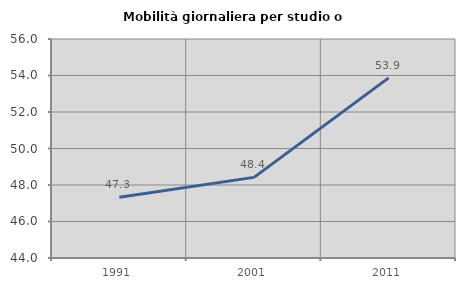
| Category | Mobilità giornaliera per studio o lavoro |
|---|---|
| 1991.0 | 47.324 |
| 2001.0 | 48.418 |
| 2011.0 | 53.871 |